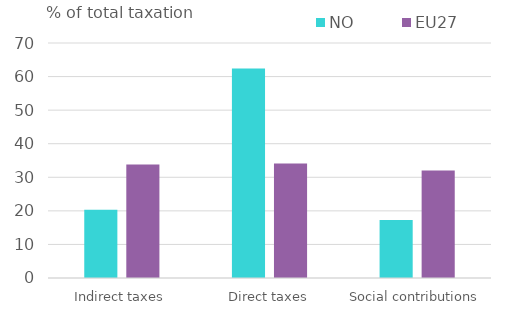
| Category | NO | EU27 |
|---|---|---|
| Indirect taxes | 20.351 | 33.811 |
| Direct taxes | 62.374 | 34.133 |
| Social contributions | 17.275 | 32.056 |